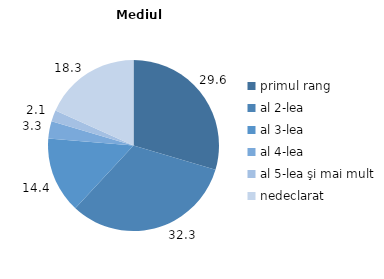
| Category | Mediul urban |
|---|---|
| primul rang | 29.6 |
| al 2-lea | 32.3 |
| al 3-lea | 14.4 |
| al 4-lea | 3.3 |
| al 5-lea şi mai mult | 2.1 |
| nedeclarat | 18.3 |